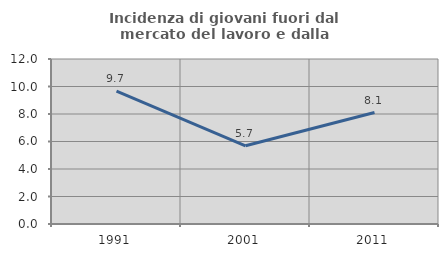
| Category | Incidenza di giovani fuori dal mercato del lavoro e dalla formazione  |
|---|---|
| 1991.0 | 9.659 |
| 2001.0 | 5.686 |
| 2011.0 | 8.108 |